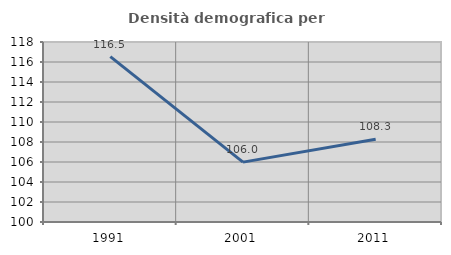
| Category | Densità demografica |
|---|---|
| 1991.0 | 116.544 |
| 2001.0 | 105.988 |
| 2011.0 | 108.273 |